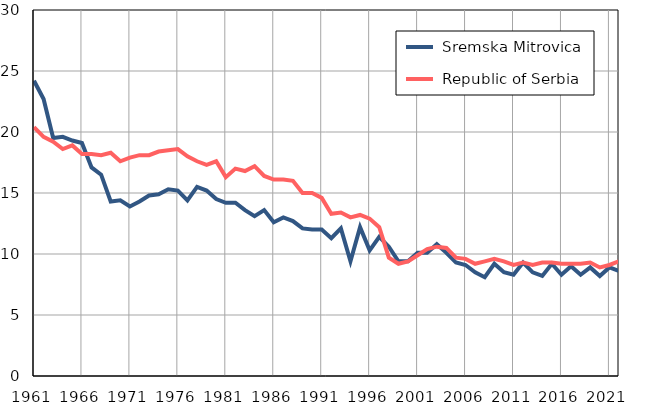
| Category |  Sremska Mitrovica |  Republic of Serbia |
|---|---|---|
| 1961.0 | 24.2 | 20.4 |
| 1962.0 | 22.7 | 19.6 |
| 1963.0 | 19.5 | 19.2 |
| 1964.0 | 19.6 | 18.6 |
| 1965.0 | 19.3 | 18.9 |
| 1966.0 | 19.1 | 18.2 |
| 1967.0 | 17.1 | 18.2 |
| 1968.0 | 16.5 | 18.1 |
| 1969.0 | 14.3 | 18.3 |
| 1970.0 | 14.4 | 17.6 |
| 1971.0 | 13.9 | 17.9 |
| 1972.0 | 14.3 | 18.1 |
| 1973.0 | 14.8 | 18.1 |
| 1974.0 | 14.9 | 18.4 |
| 1975.0 | 15.3 | 18.5 |
| 1976.0 | 15.2 | 18.6 |
| 1977.0 | 14.4 | 18 |
| 1978.0 | 15.5 | 17.6 |
| 1979.0 | 15.2 | 17.3 |
| 1980.0 | 14.5 | 17.6 |
| 1981.0 | 14.2 | 16.3 |
| 1982.0 | 14.2 | 17 |
| 1983.0 | 13.6 | 16.8 |
| 1984.0 | 13.1 | 17.2 |
| 1985.0 | 13.6 | 16.4 |
| 1986.0 | 12.6 | 16.1 |
| 1987.0 | 13 | 16.1 |
| 1988.0 | 12.7 | 16 |
| 1989.0 | 12.1 | 15 |
| 1990.0 | 12 | 15 |
| 1991.0 | 12 | 14.6 |
| 1992.0 | 11.3 | 13.3 |
| 1993.0 | 12.1 | 13.4 |
| 1994.0 | 9.4 | 13 |
| 1995.0 | 12.2 | 13.2 |
| 1996.0 | 10.3 | 12.9 |
| 1997.0 | 11.4 | 12.2 |
| 1998.0 | 10.6 | 9.7 |
| 1999.0 | 9.4 | 9.2 |
| 2000.0 | 9.4 | 9.4 |
| 2001.0 | 10.1 | 9.9 |
| 2002.0 | 10.1 | 10.4 |
| 2003.0 | 10.8 | 10.6 |
| 2004.0 | 10.1 | 10.5 |
| 2005.0 | 9.3 | 9.7 |
| 2006.0 | 9.1 | 9.6 |
| 2007.0 | 8.5 | 9.2 |
| 2008.0 | 8.1 | 9.4 |
| 2009.0 | 9.2 | 9.6 |
| 2010.0 | 8.5 | 9.4 |
| 2011.0 | 8.3 | 9.1 |
| 2012.0 | 9.3 | 9.3 |
| 2013.0 | 8.5 | 9.1 |
| 2014.0 | 8.2 | 9.3 |
| 2015.0 | 9.2 | 9.3 |
| 2016.0 | 8.3 | 9.2 |
| 2017.0 | 9 | 9.2 |
| 2018.0 | 8.3 | 9.2 |
| 2019.0 | 8.9 | 9.3 |
| 2020.0 | 8.2 | 8.9 |
| 2021.0 | 8.9 | 9.1 |
| 2022.0 | 8.6 | 9.4 |